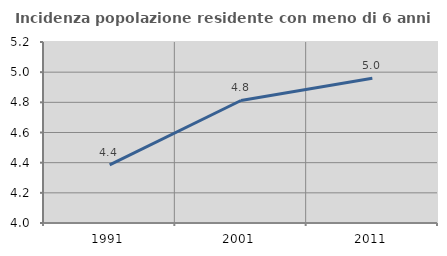
| Category | Incidenza popolazione residente con meno di 6 anni |
|---|---|
| 1991.0 | 4.385 |
| 2001.0 | 4.812 |
| 2011.0 | 4.96 |